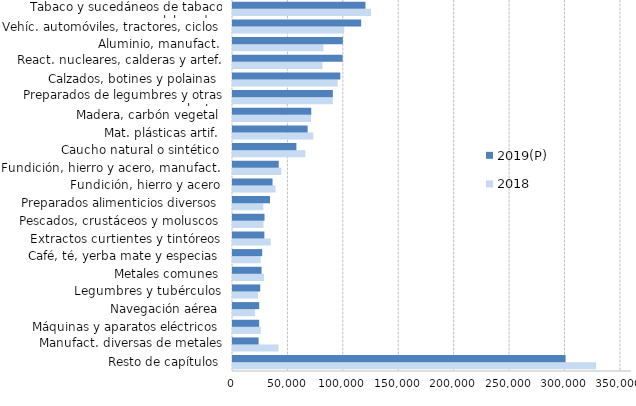
| Category | 2018 | 2019(P) |
|---|---|---|
| Resto de capítulos | 327687.077 | 300088.602 |
| Manufact. diversas de metales comunes | 41020.198 | 23104.672 |
| Máquinas y aparatos eléctricos | 24984.855 | 23630.059 |
| Navegación aérea | 19940.555 | 23649.803 |
| Legumbres y tubérculos | 22625.807 | 24568.671 |
| Metales comunes | 28010.942 | 25781.644 |
| Café, té, yerba mate y especias | 25008.1 | 26318.601 |
| Extractos curtientes y tintóreos | 33979.401 | 28290.751 |
| Pescados, crustáceos y moluscos | 27508.161 | 28418.12 |
| Preparados alimenticios diversos | 27362.784 | 33389.423 |
| Fundición, hierro y acero | 38455.799 | 35682.951 |
| Fundición, hierro y acero, manufact. | 43673.306 | 41273.644 |
| Caucho natural o sintético | 65247.952 | 57194.141 |
| Mat. plásticas artif. | 72408.517 | 67337.133 |
| Madera, carbón vegetal | 70334.06 | 70607.475 |
| Preparados de legumbres y otras plantas | 90056.815 | 90079.408 |
| Calzados, botines y polainas | 94399.112 | 96816.067 |
| React. nucleares, calderas y artef. mec. | 80692.147 | 98924.111 |
| Aluminio, manufact. | 81700.816 | 99123.788 |
| Vehíc. automóviles, tractores, ciclos | 100344.769 | 115641.497 |
| Tabaco y sucedáneos de tabaco elaborados | 124605.742 | 119516.477 |